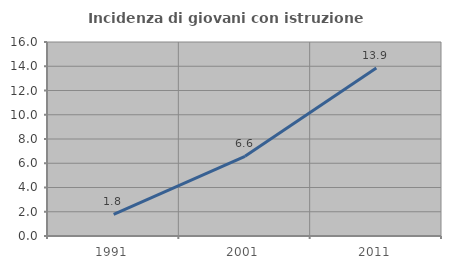
| Category | Incidenza di giovani con istruzione universitaria |
|---|---|
| 1991.0 | 1.792 |
| 2001.0 | 6.569 |
| 2011.0 | 13.853 |